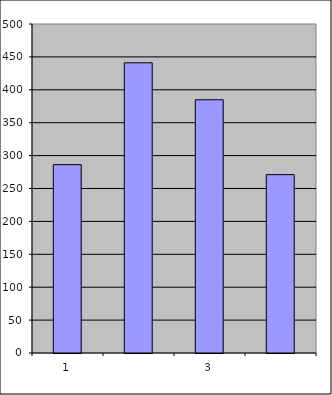
| Category | Series 0 |
|---|---|
| 0 | 286.25 |
| 1 | 441.022 |
| 2 | 384.85 |
| 3 | 271.044 |